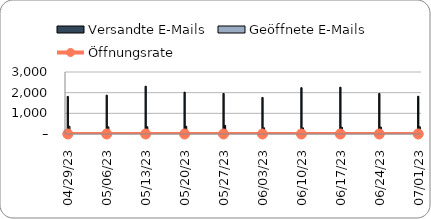
| Category | Versandte E-Mails | Geöffnete E-Mails |
|---|---|---|
| 2023-07-01 | 1825.314 | 351.929 |
| 2023-06-24 | 1959.927 | 336.931 |
| 2023-06-17 | 2265.737 | 325.918 |
| 2023-06-10 | 2241.484 | 296.781 |
| 2023-06-03 | 1769.728 | 300.854 |
| 2023-05-27 | 1961.723 | 419.556 |
| 2023-05-20 | 2024.196 | 376.041 |
| 2023-05-13 | 2312.198 | 354.468 |
| 2023-05-06 | 1878.975 | 347.202 |
| 2023-04-29 | 1818.453 | 374.399 |